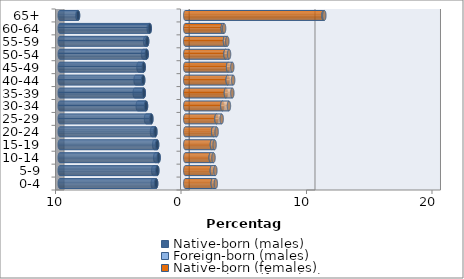
| Category | Native-born (males) | Foreign-born (males) | Native-born (females) | Foreign-born (females) |
|---|---|---|---|---|
| 0-4 | -2.319 | -0.272 | 2.196 | 0.24 |
| 5-9 | -2.227 | -0.325 | 2.12 | 0.28 |
| 10-14 | -2.125 | -0.268 | 2.029 | 0.225 |
| 15-19 | -2.24 | -0.236 | 2.125 | 0.215 |
| 20-24 | -2.38 | -0.268 | 2.226 | 0.274 |
| 25-29 | -2.7 | -0.424 | 2.488 | 0.415 |
| 30-34 | -3.126 | -0.657 | 2.955 | 0.525 |
| 35-39 | -3.3 | -0.726 | 3.241 | 0.511 |
| 40-44 | -3.352 | -0.607 | 3.381 | 0.436 |
| 45-49 | -3.31 | -0.42 | 3.412 | 0.337 |
| 50-54 | -3.071 | -0.292 | 3.21 | 0.281 |
| 55-59 | -3.035 | -0.159 | 3.167 | 0.186 |
| 60-64 | -2.828 | -0.082 | 2.995 | 0.102 |
| 65+ | -8.543 | -0.051 | 11.017 | 0.066 |